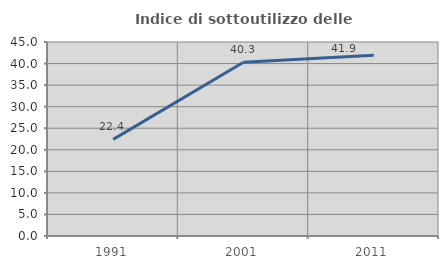
| Category | Indice di sottoutilizzo delle abitazioni  |
|---|---|
| 1991.0 | 22.404 |
| 2001.0 | 40.285 |
| 2011.0 | 41.913 |